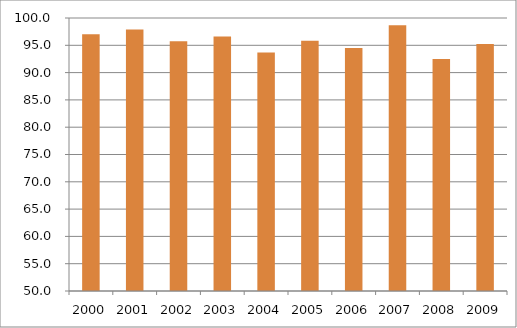
| Category | Região Sul |
|---|---|
| 2000.0 | 97.01 |
| 2001.0 | 97.9 |
| 2002.0 | 95.74 |
| 2003.0 | 96.62 |
| 2004.0 | 93.67 |
| 2005.0 | 95.85 |
| 2006.0 | 94.5 |
| 2007.0 | 98.68 |
| 2008.0 | 92.47 |
| 2009.0 | 95.22 |